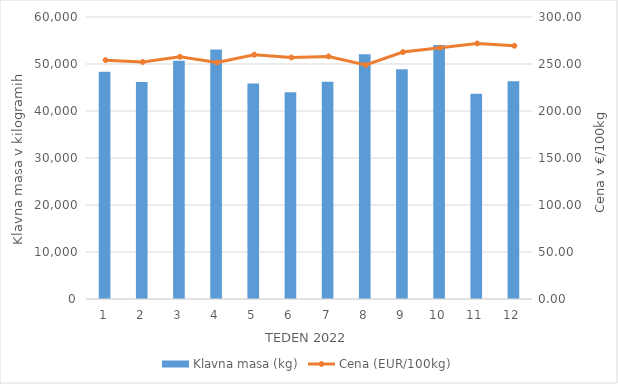
| Category | Klavna masa (kg) |
|---|---|
| 1.0 | 48349 |
| 2.0 | 46187 |
| 3.0 | 50692 |
| 4.0 | 53081 |
| 5.0 | 45844 |
| 6.0 | 43982 |
| 7.0 | 46227 |
| 8.0 | 52099 |
| 9.0 | 48872 |
| 10.0 | 54045 |
| 11.0 | 43645 |
| 12.0 | 46350 |